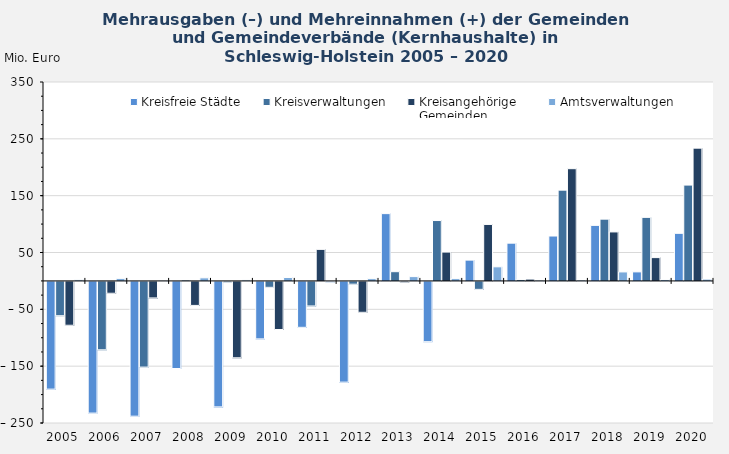
| Category | Kreisfreie Städte | Kreisverwaltungen | Kreisangehörige 
Gemeinden | Amtsverwaltungen |
|---|---|---|---|---|
| 2005-12-31 | -189.524 | -60.352 | -77.146 | 1.931 |
| 2006-12-31 | -231.686 | -120.314 | -20.826 | 4.455 |
| 2007-12-31 | -237.135 | -150.758 | -29.064 | 1.146 |
| 2008-12-31 | -153.251 | 1.626 | -42.212 | 5.387 |
| 2009-12-31 | -220.757 | -1.232 | -134.35 | 1.68 |
| 2010-12-31 | -101.125 | -10.386 | -84.657 | 6.013 |
| 2011-12-31 | -80.756 | -43.174 | 55.5 | -1.075 |
| 2012-12-31 | -177.204 | -4.886 | -54.348 | 4.027 |
| 2013-12-31 | 118.38 | 16.222 | -1.152 | 7.552 |
| 2014-12-31 | -106.044 | 106.235 | 50.765 | 4.086 |
| 2015-12-31 | 36.607 | -13.969 | 99.364 | 24.797 |
| 2016-12-31 | 66.425 | 2.397 | 3.237 | 1.497 |
| 2017-12-31 | 78.993 | 159.727 | 197.453 | 1.664 |
| 2018-12-31 | 97.704 | 108.661 | 86.188 | 15.811 |
| 2019-12-31 | 15.905 | 111.804 | 40.992 | 2.4 |
| 2020-12-31 | 83.735 | 168.591 | 233.649 | 3.206 |